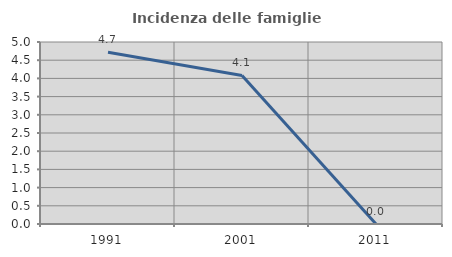
| Category | Incidenza delle famiglie numerose |
|---|---|
| 1991.0 | 4.717 |
| 2001.0 | 4.082 |
| 2011.0 | 0 |